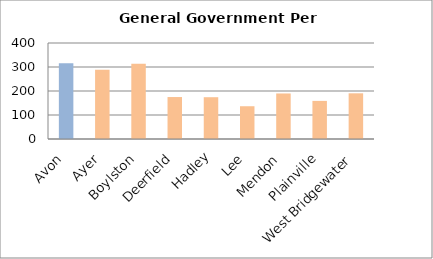
| Category | Series 0 |
|---|---|
| Avon | 316.011 |
| Ayer | 288.692 |
| Boylston | 313.64 |
| Deerfield | 174.86 |
| Hadley | 174.144 |
| Lee | 136.509 |
| Mendon | 189.706 |
| Plainville | 158.754 |
| West Bridgewater | 190.369 |